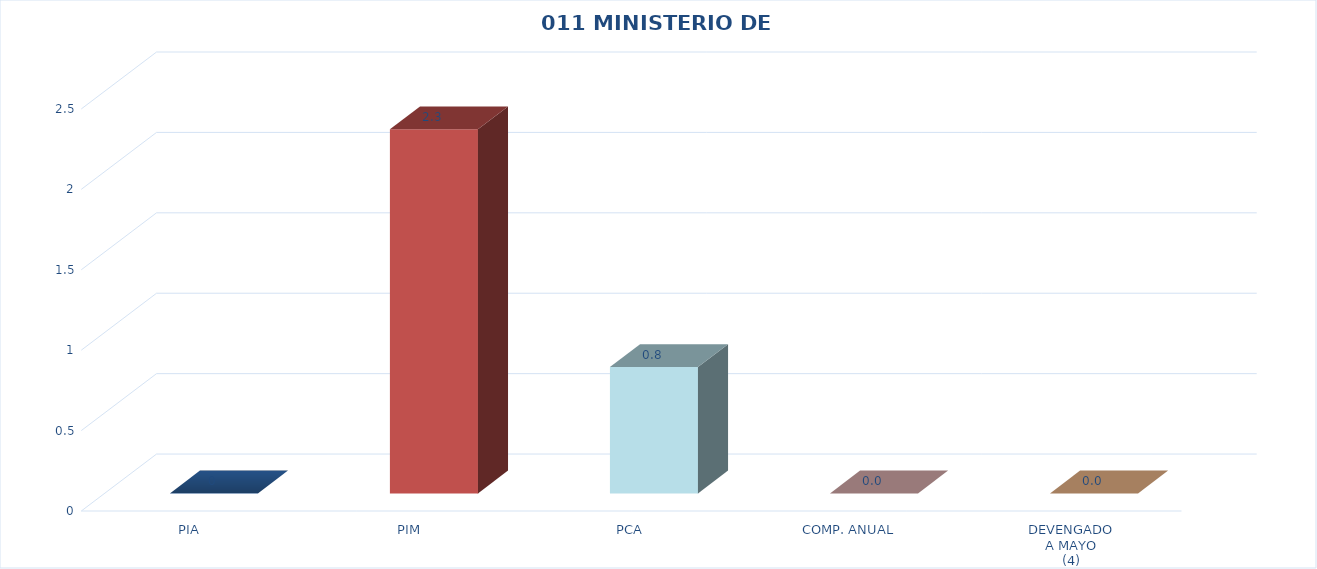
| Category | 011 MINISTERIO DE SALUD |
|---|---|
| PIA | 0 |
| PIM | 2.265 |
| PCA | 0.786 |
| COMP. ANUAL | 0 |
| DEVENGADO
A MAYO
(4) | 0 |